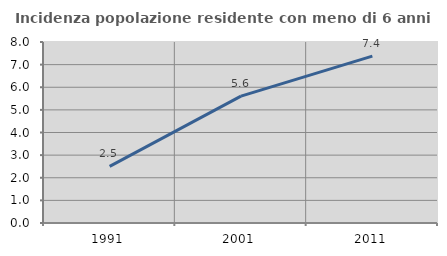
| Category | Incidenza popolazione residente con meno di 6 anni |
|---|---|
| 1991.0 | 2.5 |
| 2001.0 | 5.607 |
| 2011.0 | 7.377 |